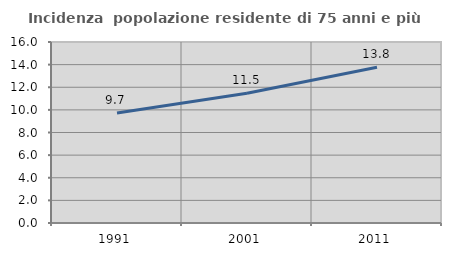
| Category | Incidenza  popolazione residente di 75 anni e più |
|---|---|
| 1991.0 | 9.722 |
| 2001.0 | 11.472 |
| 2011.0 | 13.768 |